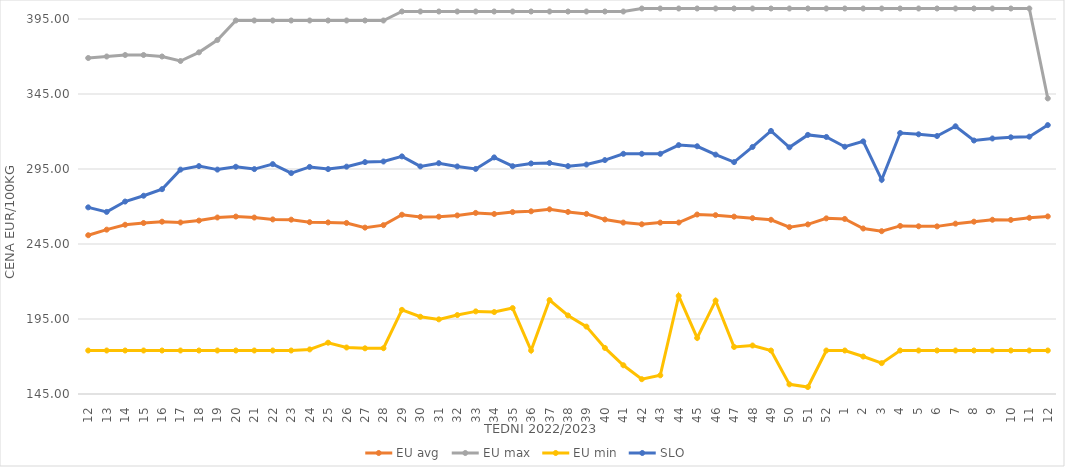
| Category | EU avg | EU max | EU min | SLO |
|---|---|---|---|---|
| 12.0 | 250.845 | 369 | 174 | 269.43 |
| 13.0 | 254.568 | 370 | 174 | 266.39 |
| 14.0 | 257.819 | 371 | 174 | 273.3 |
| 15.0 | 259 | 371 | 174 | 277.18 |
| 16.0 | 259.873 | 370 | 174 | 281.55 |
| 17.0 | 259.351 | 367 | 174 | 294.59 |
| 18.0 | 260.6 | 372.758 | 174 | 296.93 |
| 19.0 | 262.669 | 381 | 174 | 294.6 |
| 20.0 | 263.291 | 394 | 174 | 296.48 |
| 21.0 | 262.64 | 394 | 174 | 294.94 |
| 22.0 | 261.388 | 394 | 174 | 298.26 |
| 23.0 | 261.228 | 394 | 174 | 292.27 |
| 24.0 | 259.544 | 394 | 174.72 | 296.39 |
| 25.0 | 259.395 | 394 | 179.2 | 294.93 |
| 26.0 | 259.018 | 394 | 176 | 296.56 |
| 27.0 | 255.922 | 394 | 175.451 | 299.59 |
| 28.0 | 257.564 | 394 | 175.52 | 300.01 |
| 29.0 | 264.52 | 400 | 201.097 | 303.41 |
| 30.0 | 263.067 | 400 | 196.496 | 296.73 |
| 31.0 | 263.196 | 400 | 194.756 | 298.88 |
| 32.0 | 264.059 | 400 | 197.634 | 296.7 |
| 33.0 | 265.729 | 400 | 200.07 | 295.05 |
| 34.0 | 265.016 | 400 | 199.637 | 302.73 |
| 35.0 | 266.273 | 400 | 202.277 | 296.86 |
| 36.0 | 266.807 | 400 | 174 | 298.7 |
| 37.0 | 268.136 | 400 | 207.594 | 299.02 |
| 38.0 | 266.39 | 400 | 197.352 | 296.91 |
| 39.0 | 265.059 | 400 | 189.926 | 297.96 |
| 40.0 | 261.35 | 400 | 175.723 | 300.95 |
| 41.0 | 259.271 | 400 | 164.165 | 305.13 |
| 42.0 | 258.146 | 402 | 154.869 | 305.13 |
| 43.0 | 259.256 | 402 | 157.459 | 305.13 |
| 44.0 | 259.32 | 402 | 210.415 | 310.93 |
| 45.0 | 264.649 | 402 | 182.35 | 310.16 |
| 46.0 | 264.228 | 402 | 207.247 | 304.58 |
| 47.0 | 263.24 | 402 | 176.378 | 299.59 |
| 48.0 | 262.225 | 402 | 177.332 | 309.69 |
| 49.0 | 261.152 | 402 | 174 | 320.38 |
| 50.0 | 256.24 | 402 | 151.434 | 309.44 |
| 51.0 | 258.071 | 402 | 149.638 | 317.74 |
| 52.0 | 262.088 | 402 | 174 | 316.36 |
| 1.0 | 261.716 | 402 | 174 | 309.84 |
| 2.0 | 255.331 | 402 | 169.983 | 313.4 |
| 3.0 | 253.546 | 402 | 165.574 | 287.81 |
| 4.0 | 257.051 | 402 | 174 | 318.98 |
| 5.0 | 256.808 | 402 | 174 | 318.13 |
| 6.0 | 256.75 | 402 | 174 | 316.99 |
| 7.0 | 258.565 | 402 | 174 | 323.47 |
| 8.0 | 259.872 | 402 | 174 | 314 |
| 9.0 | 261.166 | 402 | 174 | 315.35 |
| 10.0 | 261.061 | 402 | 174 | 316.13 |
| 11.0 | 262.462 | 402 | 174 | 316.55 |
| 12.0 | 263.399 | 342.06 | 174 | 324.27 |